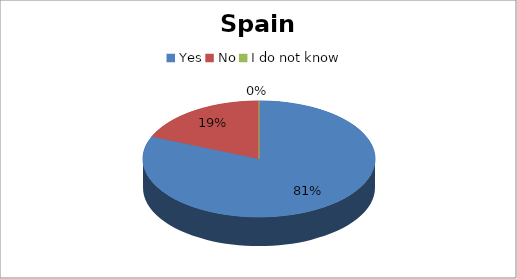
| Category | Series 0 |
|---|---|
| Yes | 26 |
| No | 6 |
| I do not know | 0 |